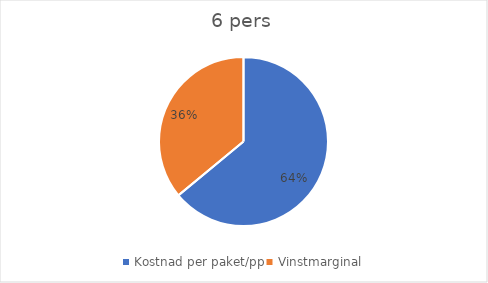
| Category | Series 0 |
|---|---|
| Kostnad per paket/pp | 8000 |
| Vinstmarginal | 4500 |